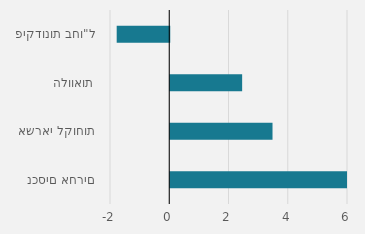
| Category | Series 0 |
|---|---|
| נכסים אחרים | 6010 |
| אשראי לקוחות | 3452 |
| הלוואות | 2427 |
| פיקדונות בחו"ל | -1774 |